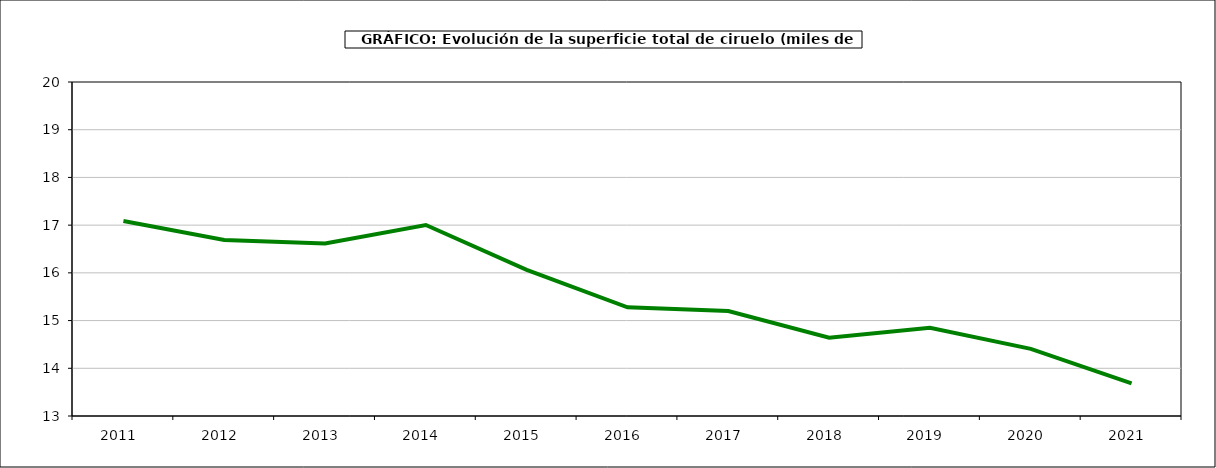
| Category | superficie ciruelo |
|---|---|
| 2011.0 | 17.086 |
| 2012.0 | 16.687 |
| 2013.0 | 16.614 |
| 2014.0 | 17.003 |
| 2015.0 | 16.064 |
| 2016.0 | 15.278 |
| 2017.0 | 15.199 |
| 2018.0 | 14.64 |
| 2019.0 | 14.851 |
| 2020.0 | 14.406 |
| 2021.0 | 13.685 |